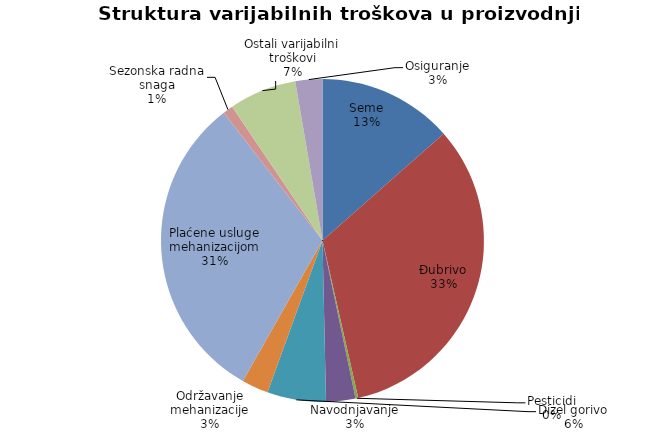
| Category | Series 0 |
|---|---|
| Seme | 10000 |
| Đubrivo | 24400 |
| Pesticidi | 200 |
| Navodnjavanje | 2175 |
| Dizel gorivo | 4350 |
| Održavanje mehanizacije | 1985 |
| Plaćene usluge mehanizacijom | 23200 |
| Sezonska radna snaga | 750 |
| Ostali varijabilni troškovi | 5000 |
| Osiguranje | 2000 |